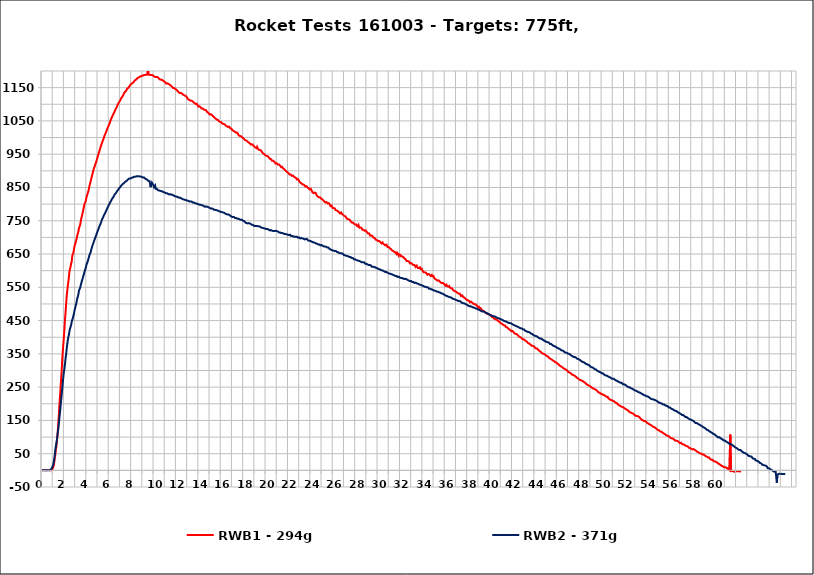
| Category | RWB1 - 294g | RWB2 - 371g |
|---|---|---|
| 0.0 | 0 | 1 |
| 0.05000000000000002 | 1 | 1 |
| 0.1 | 1 | 0 |
| 0.15 | 1 | 0 |
| 0.20000000000000004 | 1 | 0 |
| 0.25 | 1 | 1 |
| 0.30000000000000004 | 1 | 0 |
| 0.35 | 1 | 0 |
| 0.4 | 0 | 0 |
| 0.45000000000000007 | 1 | 0 |
| 0.5000000000000001 | 1 | 1 |
| 0.55 | 1 | 1 |
| 0.6000000000000001 | 1 | 0 |
| 0.65 | 0 | 1 |
| 0.7000000000000001 | 0 | 1 |
| 0.7500000000000001 | 1 | 1 |
| 0.8 | 0 | 3 |
| 0.8500000000000001 | 2 | 6 |
| 0.9 | 2 | 8 |
| 0.9500000000000001 | 5 | 12 |
| 1.0 | 9 | 17 |
| 1.05 | 15 | 25 |
| 1.1 | 26 | 36 |
| 1.15 | 38 | 49 |
| 1.2 | 51 | 65 |
| 1.25 | 65 | 75 |
| 1.3 | 77 | 85 |
| 1.35 | 95 | 96 |
| 1.4 | 114 | 111 |
| 1.45 | 138 | 123 |
| 1.5 | 165 | 139 |
| 1.55 | 193 | 157 |
| 1.6 | 219 | 172 |
| 1.65 | 244 | 190 |
| 1.7 | 271 | 208 |
| 1.75 | 295 | 225 |
| 1.8 | 329 | 243 |
| 1.85 | 355 | 260 |
| 1.9 | 377 | 280 |
| 1.9500000000000002 | 398 | 294 |
| 2.0 | 424 | 305 |
| 2.05 | 452 | 319 |
| 2.1 | 473 | 335 |
| 2.15 | 498 | 348 |
| 2.2 | 522 | 364 |
| 2.25 | 538 | 378 |
| 2.3000000000000003 | 553 | 390 |
| 2.35 | 566 | 400 |
| 2.4 | 580 | 408 |
| 2.45 | 598 | 418 |
| 2.5 | 599 | 426 |
| 2.5500000000000003 | 612 | 431 |
| 2.6 | 622 | 437 |
| 2.65 | 626 | 446 |
| 2.7 | 644 | 452 |
| 2.75 | 649 | 457 |
| 2.8000000000000003 | 654 | 464 |
| 2.85 | 663 | 470 |
| 2.9 | 673 | 480 |
| 2.95 | 679 | 486 |
| 3.0 | 684 | 494 |
| 3.0500000000000003 | 691 | 500 |
| 3.1 | 697 | 508 |
| 3.15 | 706 | 517 |
| 3.2 | 708 | 522 |
| 3.25 | 718 | 529 |
| 3.3000000000000003 | 728 | 540 |
| 3.35 | 732 | 543 |
| 3.4 | 737 | 548 |
| 3.45 | 746 | 555 |
| 3.5 | 756 | 561 |
| 3.5500000000000003 | 762 | 568 |
| 3.6 | 770 | 573 |
| 3.65 | 777 | 579 |
| 3.7 | 785 | 585 |
| 3.75 | 794 | 591 |
| 3.8000000000000003 | 801 | 597 |
| 3.85 | 803 | 603 |
| 3.9 | 808 | 607 |
| 3.9499999999999997 | 817 | 615 |
| 4.000000000000001 | 824 | 621 |
| 4.050000000000001 | 829 | 625 |
| 4.1000000000000005 | 835 | 630 |
| 4.15 | 840 | 636 |
| 4.2 | 848 | 642 |
| 4.250000000000001 | 857 | 648 |
| 4.300000000000001 | 862 | 652 |
| 4.3500000000000005 | 870 | 656 |
| 4.4 | 876 | 664 |
| 4.45 | 883 | 669 |
| 4.500000000000001 | 890 | 675 |
| 4.550000000000001 | 896 | 680 |
| 4.6000000000000005 | 903 | 684 |
| 4.65 | 909 | 689 |
| 4.700000000000001 | 913 | 694 |
| 4.750000000000001 | 919 | 697 |
| 4.800000000000001 | 923 | 703 |
| 4.8500000000000005 | 929 | 707 |
| 4.9 | 934 | 713 |
| 4.950000000000001 | 940 | 717 |
| 5.000000000000001 | 946 | 722 |
| 5.050000000000001 | 952 | 726 |
| 5.1000000000000005 | 956 | 731 |
| 5.15 | 963 | 734 |
| 5.200000000000001 | 968 | 739 |
| 5.250000000000001 | 974 | 742 |
| 5.300000000000001 | 979 | 748 |
| 5.3500000000000005 | 983 | 753 |
| 5.4 | 988 | 756 |
| 5.450000000000001 | 993 | 760 |
| 5.500000000000001 | 997 | 764 |
| 5.550000000000001 | 1003 | 768 |
| 5.6000000000000005 | 1007 | 771 |
| 5.65 | 1011 | 774 |
| 5.700000000000001 | 1015 | 778 |
| 5.750000000000001 | 1019 | 782 |
| 5.800000000000001 | 1024 | 785 |
| 5.8500000000000005 | 1028 | 789 |
| 5.9 | 1032 | 793 |
| 5.950000000000001 | 1036 | 796 |
| 6.000000000000001 | 1040 | 799 |
| 6.050000000000001 | 1044 | 802 |
| 6.1000000000000005 | 1050 | 806 |
| 6.15 | 1054 | 809 |
| 6.200000000000001 | 1057 | 812 |
| 6.250000000000001 | 1062 | 816 |
| 6.300000000000001 | 1064 | 819 |
| 6.3500000000000005 | 1069 | 820 |
| 6.4 | 1072 | 823 |
| 6.450000000000001 | 1076 | 826 |
| 6.500000000000001 | 1080 | 830 |
| 6.550000000000001 | 1084 | 831 |
| 6.6000000000000005 | 1087 | 833 |
| 6.65 | 1090 | 836 |
| 6.700000000000001 | 1094 | 839 |
| 6.750000000000001 | 1098 | 840 |
| 6.800000000000001 | 1102 | 843 |
| 6.8500000000000005 | 1105 | 846 |
| 6.9 | 1107 | 848 |
| 6.950000000000001 | 1110 | 850 |
| 7.000000000000001 | 1113 | 852 |
| 7.050000000000001 | 1117 | 855 |
| 7.1000000000000005 | 1119 | 857 |
| 7.15 | 1122 | 858 |
| 7.200000000000001 | 1125 | 860 |
| 7.250000000000001 | 1127 | 861 |
| 7.300000000000001 | 1132 | 863 |
| 7.3500000000000005 | 1134 | 864 |
| 7.4 | 1137 | 866 |
| 7.450000000000001 | 1139 | 868 |
| 7.500000000000001 | 1140 | 869 |
| 7.550000000000001 | 1143 | 871 |
| 7.6000000000000005 | 1147 | 871 |
| 7.65 | 1147 | 873 |
| 7.700000000000001 | 1149 | 875 |
| 7.750000000000001 | 1152 | 875 |
| 7.800000000000001 | 1154 | 877 |
| 7.8500000000000005 | 1157 | 877 |
| 7.9 | 1159 | 877 |
| 7.950000000000001 | 1160 | 880 |
| 8.0 | 1162 | 879 |
| 8.05 | 1163 | 880 |
| 8.100000000000001 | 1164 | 880 |
| 8.15 | 1166 | 881 |
| 8.200000000000001 | 1168 | 882 |
| 8.25 | 1170 | 882 |
| 8.3 | 1172 | 882 |
| 8.350000000000001 | 1173 | 882 |
| 8.4 | 1174 | 883 |
| 8.450000000000001 | 1175 | 883 |
| 8.5 | 1178 | 884 |
| 8.55 | 1178 | 884 |
| 8.600000000000001 | 1180 | 884 |
| 8.65 | 1181 | 884 |
| 8.700000000000001 | 1182 | 883 |
| 8.75 | 1182 | 883 |
| 8.8 | 1184 | 883 |
| 8.850000000000001 | 1184 | 882 |
| 8.9 | 1185 | 882 |
| 8.950000000000001 | 1187 | 882 |
| 9.0 | 1186 | 880 |
| 9.05 | 1186 | 879 |
| 9.100000000000001 | 1188 | 880 |
| 9.15 | 1188 | 878 |
| 9.200000000000001 | 1188 | 877 |
| 9.25 | 1189 | 877 |
| 9.3 | 1189 | 875 |
| 9.350000000000001 | 1189 | 874 |
| 9.4 | 1190 | 873 |
| 9.450000000000001 | 1215 | 872 |
| 9.500000000000002 | 1189 | 870 |
| 9.55 | 1190 | 869 |
| 9.600000000000001 | 1189 | 869 |
| 9.65 | 1187 | 867 |
| 9.700000000000001 | 1188 | 851 |
| 9.750000000000002 | 1188 | 861 |
| 9.8 | 1188 | 865 |
| 9.850000000000001 | 1188 | 863 |
| 9.9 | 1187 | 860 |
| 9.950000000000001 | 1187 | 857 |
| 10.000000000000002 | 1184 | 851 |
| 10.05 | 1184 | 853 |
| 10.100000000000001 | 1182 | 856 |
| 10.15 | 1182 | 846 |
| 10.200000000000001 | 1182 | 847 |
| 10.250000000000002 | 1182 | 846 |
| 10.3 | 1182 | 845 |
| 10.350000000000001 | 1181 | 842 |
| 10.4 | 1179 | 841 |
| 10.450000000000001 | 1177 | 841 |
| 10.500000000000002 | 1175 | 840 |
| 10.55 | 1175 | 840 |
| 10.600000000000001 | 1174 | 839 |
| 10.65 | 1174 | 839 |
| 10.700000000000001 | 1174 | 840 |
| 10.750000000000002 | 1173 | 838 |
| 10.8 | 1171 | 837 |
| 10.850000000000001 | 1170 | 836 |
| 10.9 | 1169 | 837 |
| 10.950000000000001 | 1168 | 835 |
| 11.000000000000002 | 1166 | 836 |
| 11.05 | 1164 | 833 |
| 11.100000000000001 | 1162 | 833 |
| 11.15 | 1161 | 833 |
| 11.200000000000001 | 1163 | 833 |
| 11.250000000000002 | 1162 | 831 |
| 11.3 | 1161 | 830 |
| 11.350000000000001 | 1160 | 829 |
| 11.4 | 1159 | 830 |
| 11.450000000000001 | 1156 | 830 |
| 11.500000000000002 | 1156 | 828 |
| 11.55 | 1155 | 828 |
| 11.600000000000001 | 1153 | 826 |
| 11.65 | 1150 | 828 |
| 11.700000000000001 | 1149 | 827 |
| 11.750000000000002 | 1148 | 826 |
| 11.8 | 1149 | 824 |
| 11.850000000000001 | 1147 | 824 |
| 11.9 | 1146 | 825 |
| 11.950000000000001 | 1144 | 823 |
| 12.000000000000002 | 1144 | 821 |
| 12.05 | 1142 | 822 |
| 12.100000000000001 | 1140 | 821 |
| 12.15 | 1138 | 821 |
| 12.200000000000001 | 1136 | 820 |
| 12.250000000000002 | 1136 | 819 |
| 12.3 | 1134 | 819 |
| 12.350000000000001 | 1134 | 819 |
| 12.4 | 1134 | 818 |
| 12.450000000000001 | 1132 | 817 |
| 12.500000000000002 | 1132 | 816 |
| 12.55 | 1129 | 815 |
| 12.600000000000001 | 1129 | 814 |
| 12.65 | 1128 | 814 |
| 12.700000000000001 | 1127 | 815 |
| 12.750000000000002 | 1125 | 813 |
| 12.8 | 1125 | 813 |
| 12.850000000000001 | 1126 | 812 |
| 12.9 | 1123 | 811 |
| 12.950000000000001 | 1120 | 811 |
| 13.000000000000002 | 1117 | 811 |
| 13.05 | 1116 | 810 |
| 13.100000000000001 | 1114 | 810 |
| 13.15 | 1113 | 808 |
| 13.200000000000001 | 1112 | 807 |
| 13.250000000000002 | 1111 | 808 |
| 13.3 | 1111 | 807 |
| 13.350000000000001 | 1111 | 808 |
| 13.4 | 1110 | 806 |
| 13.450000000000001 | 1108 | 805 |
| 13.500000000000002 | 1107 | 804 |
| 13.55 | 1106 | 805 |
| 13.600000000000001 | 1104 | 804 |
| 13.65 | 1102 | 803 |
| 13.700000000000001 | 1101 | 802 |
| 13.750000000000002 | 1102 | 802 |
| 13.8 | 1102 | 801 |
| 13.850000000000001 | 1099 | 801 |
| 13.9 | 1097 | 801 |
| 13.950000000000001 | 1093 | 800 |
| 14.000000000000002 | 1094 | 798 |
| 14.05 | 1094 | 798 |
| 14.100000000000001 | 1094 | 797 |
| 14.15 | 1091 | 798 |
| 14.200000000000001 | 1089 | 797 |
| 14.250000000000002 | 1087 | 797 |
| 14.3 | 1088 | 797 |
| 14.350000000000001 | 1087 | 796 |
| 14.4 | 1087 | 794 |
| 14.450000000000001 | 1084 | 794 |
| 14.500000000000002 | 1082 | 794 |
| 14.55 | 1083 | 792 |
| 14.600000000000001 | 1085 | 792 |
| 14.65 | 1082 | 793 |
| 14.700000000000001 | 1078 | 793 |
| 14.750000000000002 | 1076 | 792 |
| 14.8 | 1076 | 790 |
| 14.850000000000001 | 1075 | 791 |
| 14.9 | 1072 | 790 |
| 14.950000000000001 | 1071 | 789 |
| 15.000000000000002 | 1069 | 789 |
| 15.05 | 1071 | 787 |
| 15.100000000000001 | 1070 | 787 |
| 15.15 | 1068 | 787 |
| 15.200000000000001 | 1067 | 785 |
| 15.250000000000002 | 1064 | 786 |
| 15.3 | 1063 | 785 |
| 15.350000000000001 | 1061 | 783 |
| 15.4 | 1060 | 783 |
| 15.450000000000001 | 1058 | 783 |
| 15.500000000000002 | 1057 | 783 |
| 15.55 | 1055 | 782 |
| 15.600000000000001 | 1054 | 782 |
| 15.65 | 1053 | 781 |
| 15.700000000000001 | 1053 | 780 |
| 15.750000000000002 | 1052 | 780 |
| 15.8 | 1049 | 779 |
| 15.850000000000001 | 1047 | 778 |
| 15.9 | 1047 | 777 |
| 15.950000000000001 | 1047 | 777 |
| 16.0 | 1046 | 776 |
| 16.05 | 1044 | 776 |
| 16.099999999999998 | 1042 | 776 |
| 16.15 | 1042 | 775 |
| 16.2 | 1041 | 775 |
| 16.25 | 1042 | 774 |
| 16.3 | 1040 | 774 |
| 16.349999999999998 | 1037 | 772 |
| 16.4 | 1036 | 771 |
| 16.45 | 1035 | 770 |
| 16.5 | 1034 | 770 |
| 16.55 | 1032 | 769 |
| 16.599999999999998 | 1032 | 767 |
| 16.65 | 1034 | 769 |
| 16.7 | 1033 | 767 |
| 16.75 | 1030 | 767 |
| 16.8 | 1028 | 765 |
| 16.849999999999998 | 1028 | 764 |
| 16.9 | 1027 | 764 |
| 16.95 | 1025 | 762 |
| 17.0 | 1022 | 762 |
| 17.05 | 1021 | 761 |
| 17.099999999999998 | 1020 | 761 |
| 17.15 | 1019 | 761 |
| 17.2 | 1018 | 760 |
| 17.25 | 1016 | 758 |
| 17.3 | 1015 | 759 |
| 17.349999999999998 | 1014 | 758 |
| 17.4 | 1015 | 757 |
| 17.45 | 1015 | 756 |
| 17.5 | 1011 | 756 |
| 17.55 | 1007 | 756 |
| 17.599999999999998 | 1005 | 754 |
| 17.65 | 1005 | 754 |
| 17.7 | 1005 | 753 |
| 17.75 | 1004 | 753 |
| 17.8 | 1003 | 752 |
| 17.849999999999998 | 1001 | 753 |
| 17.9 | 1001 | 752 |
| 17.95 | 999 | 750 |
| 18.0 | 996 | 749 |
| 18.05 | 995 | 749 |
| 18.099999999999998 | 994 | 748 |
| 18.15 | 992 | 745 |
| 18.2 | 991 | 745 |
| 18.25 | 991 | 743 |
| 18.3 | 990 | 742 |
| 18.349999999999998 | 988 | 742 |
| 18.4 | 986 | 742 |
| 18.45 | 985 | 743 |
| 18.5 | 985 | 743 |
| 18.55 | 983 | 742 |
| 18.599999999999998 | 983 | 741 |
| 18.65 | 979 | 740 |
| 18.7 | 978 | 739 |
| 18.75 | 980 | 738 |
| 18.8 | 980 | 739 |
| 18.849999999999998 | 977 | 737 |
| 18.9 | 974 | 736 |
| 18.95 | 973 | 734 |
| 19.0 | 974 | 734 |
| 19.05 | 970 | 734 |
| 19.1 | 968 | 735 |
| 19.15 | 968 | 734 |
| 19.2 | 972 | 734 |
| 19.25 | 968 | 734 |
| 19.3 | 966 | 733 |
| 19.35 | 963 | 733 |
| 19.4 | 963 | 734 |
| 19.45 | 963 | 733 |
| 19.5 | 962 | 731 |
| 19.55 | 961 | 730 |
| 19.6 | 959 | 730 |
| 19.65 | 956 | 729 |
| 19.7 | 954 | 728 |
| 19.75 | 952 | 728 |
| 19.8 | 951 | 728 |
| 19.85 | 950 | 727 |
| 19.9 | 948 | 726 |
| 19.95 | 946 | 726 |
| 20.0 | 946 | 725 |
| 20.05 | 945 | 725 |
| 20.1 | 945 | 725 |
| 20.15 | 944 | 725 |
| 20.2 | 941 | 725 |
| 20.25 | 940 | 723 |
| 20.3 | 938 | 722 |
| 20.35 | 936 | 721 |
| 20.4 | 935 | 721 |
| 20.45 | 935 | 722 |
| 20.5 | 932 | 721 |
| 20.55 | 930 | 720 |
| 20.6 | 931 | 720 |
| 20.65 | 930 | 719 |
| 20.7 | 929 | 719 |
| 20.75 | 927 | 719 |
| 20.8 | 925 | 718 |
| 20.85 | 922 | 720 |
| 20.9 | 924 | 719 |
| 20.95 | 923 | 719 |
| 21.0 | 922 | 718 |
| 21.05 | 919 | 718 |
| 21.1 | 916 | 716 |
| 21.15 | 919 | 715 |
| 21.2 | 920 | 715 |
| 21.25 | 916 | 715 |
| 21.3 | 913 | 714 |
| 21.35 | 911 | 713 |
| 21.4 | 913 | 713 |
| 21.45 | 912 | 713 |
| 21.5 | 908 | 713 |
| 21.55 | 905 | 712 |
| 21.6 | 906 | 712 |
| 21.65 | 904 | 710 |
| 21.7 | 902 | 710 |
| 21.75 | 902 | 710 |
| 21.8 | 899 | 709 |
| 21.85 | 896 | 709 |
| 21.9 | 896 | 710 |
| 21.95 | 895 | 708 |
| 22.0 | 893 | 707 |
| 22.05 | 891 | 707 |
| 22.1 | 889 | 707 |
| 22.15 | 891 | 708 |
| 22.2 | 889 | 705 |
| 22.25 | 887 | 704 |
| 22.3 | 885 | 705 |
| 22.35 | 884 | 704 |
| 22.4 | 886 | 704 |
| 22.45 | 886 | 703 |
| 22.5 | 882 | 704 |
| 22.55 | 879 | 702 |
| 22.6 | 880 | 703 |
| 22.65 | 882 | 702 |
| 22.7 | 878 | 702 |
| 22.75 | 874 | 702 |
| 22.8 | 873 | 700 |
| 22.85 | 875 | 699 |
| 22.9 | 873 | 700 |
| 22.95 | 870 | 700 |
| 23.0 | 866 | 699 |
| 23.05 | 865 | 697 |
| 23.1 | 864 | 698 |
| 23.15 | 863 | 698 |
| 23.2 | 861 | 697 |
| 23.25 | 859 | 697 |
| 23.3 | 859 | 697 |
| 23.35 | 860 | 696 |
| 23.4 | 858 | 695 |
| 23.45 | 855 | 694 |
| 23.5 | 853 | 694 |
| 23.55 | 853 | 695 |
| 23.6 | 854 | 694 |
| 23.65 | 852 | 695 |
| 23.7 | 850 | 693 |
| 23.75 | 850 | 691 |
| 23.8 | 848 | 690 |
| 23.85 | 847 | 690 |
| 23.9 | 844 | 689 |
| 23.95 | 842 | 689 |
| 24.0 | 846 | 688 |
| 24.05 | 844 | 688 |
| 24.1 | 839 | 688 |
| 24.15 | 835 | 686 |
| 24.2 | 834 | 685 |
| 24.25 | 833 | 685 |
| 24.3 | 834 | 684 |
| 24.35 | 835 | 684 |
| 24.4 | 837 | 683 |
| 24.45 | 833 | 682 |
| 24.5 | 828 | 682 |
| 24.55 | 826 | 681 |
| 24.6 | 823 | 680 |
| 24.65 | 823 | 679 |
| 24.7 | 821 | 679 |
| 24.75 | 822 | 679 |
| 24.8 | 821 | 677 |
| 24.85 | 818 | 676 |
| 24.9 | 817 | 676 |
| 24.95 | 816 | 677 |
| 25.0 | 815 | 675 |
| 25.05 | 813 | 675 |
| 25.1 | 812 | 674 |
| 25.15 | 810 | 673 |
| 25.2 | 808 | 672 |
| 25.25 | 806 | 673 |
| 25.3 | 805 | 673 |
| 25.35 | 805 | 672 |
| 25.4 | 806 | 672 |
| 25.45 | 804 | 670 |
| 25.5 | 802 | 670 |
| 25.55 | 800 | 670 |
| 25.6 | 803 | 668 |
| 25.65 | 802 | 666 |
| 25.7 | 798 | 666 |
| 25.75 | 794 | 664 |
| 25.8 | 795 | 663 |
| 25.85 | 796 | 662 |
| 25.9 | 792 | 663 |
| 25.95 | 788 | 661 |
| 26.0 | 787 | 661 |
| 26.05 | 788 | 660 |
| 26.1 | 789 | 659 |
| 26.15 | 787 | 659 |
| 26.2 | 782 | 659 |
| 26.25 | 780 | 659 |
| 26.3 | 781 | 657 |
| 26.35 | 779 | 656 |
| 26.4 | 779 | 656 |
| 26.45 | 777 | 655 |
| 26.5 | 776 | 654 |
| 26.55 | 774 | 653 |
| 26.6 | 772 | 653 |
| 26.65 | 774 | 652 |
| 26.7 | 775 | 653 |
| 26.75 | 772 | 652 |
| 26.8 | 770 | 652 |
| 26.85 | 769 | 651 |
| 26.9 | 767 | 649 |
| 26.95 | 765 | 647 |
| 27.0 | 764 | 647 |
| 27.05 | 766 | 646 |
| 27.1 | 763 | 645 |
| 27.15 | 760 | 645 |
| 27.2 | 757 | 644 |
| 27.25 | 758 | 644 |
| 27.3 | 755 | 643 |
| 27.35 | 755 | 643 |
| 27.4 | 754 | 642 |
| 27.45 | 756 | 641 |
| 27.5 | 752 | 642 |
| 27.55 | 748 | 641 |
| 27.6 | 746 | 639 |
| 27.65 | 745 | 638 |
| 27.7 | 745 | 638 |
| 27.75 | 745 | 638 |
| 27.8 | 743 | 636 |
| 27.85 | 741 | 634 |
| 27.9 | 739 | 634 |
| 27.95 | 739 | 634 |
| 28.0 | 740 | 633 |
| 28.05 | 739 | 632 |
| 28.1 | 735 | 632 |
| 28.15 | 733 | 631 |
| 28.2 | 733 | 630 |
| 28.25 | 737 | 630 |
| 28.3 | 733 | 629 |
| 28.35 | 729 | 629 |
| 28.4 | 727 | 628 |
| 28.45 | 730 | 627 |
| 28.5 | 729 | 626 |
| 28.55 | 727 | 625 |
| 28.6 | 723 | 626 |
| 28.65 | 725 | 625 |
| 28.7 | 723 | 624 |
| 28.75 | 722 | 625 |
| 28.8 | 720 | 623 |
| 28.85 | 721 | 621 |
| 28.9 | 721 | 621 |
| 28.95 | 720 | 621 |
| 29.0 | 716 | 620 |
| 29.05 | 713 | 619 |
| 29.1 | 712 | 618 |
| 29.15 | 712 | 617 |
| 29.2 | 712 | 617 |
| 29.25 | 709 | 617 |
| 29.3 | 705 | 617 |
| 29.35 | 705 | 616 |
| 29.4 | 706 | 614 |
| 29.45 | 706 | 612 |
| 29.5 | 704 | 612 |
| 29.55 | 701 | 612 |
| 29.6 | 699 | 611 |
| 29.65 | 698 | 611 |
| 29.7 | 698 | 610 |
| 29.75 | 695 | 610 |
| 29.8 | 693 | 609 |
| 29.85 | 693 | 608 |
| 29.9 | 692 | 607 |
| 29.95 | 689 | 607 |
| 30.0 | 689 | 606 |
| 30.05 | 691 | 605 |
| 30.1 | 689 | 604 |
| 30.15 | 688 | 604 |
| 30.2 | 686 | 603 |
| 30.25 | 683 | 602 |
| 30.3 | 682 | 602 |
| 30.35 | 684 | 601 |
| 30.4 | 685 | 600 |
| 30.45 | 681 | 600 |
| 30.5 | 679 | 599 |
| 30.55 | 679 | 598 |
| 30.6 | 677 | 598 |
| 30.65 | 676 | 596 |
| 30.7 | 676 | 597 |
| 30.75 | 678 | 596 |
| 30.8 | 675 | 595 |
| 30.85 | 671 | 594 |
| 30.9 | 670 | 592 |
| 30.95 | 671 | 592 |
| 31.0 | 669 | 593 |
| 31.05 | 667 | 591 |
| 31.1 | 665 | 590 |
| 31.15 | 665 | 590 |
| 31.2 | 665 | 589 |
| 31.25 | 661 | 589 |
| 31.3 | 659 | 588 |
| 31.35 | 659 | 587 |
| 31.4 | 658 | 587 |
| 31.45 | 657 | 586 |
| 31.5 | 657 | 585 |
| 31.55 | 654 | 584 |
| 31.6 | 652 | 584 |
| 31.65 | 650 | 584 |
| 31.7 | 654 | 582 |
| 31.75 | 652 | 581 |
| 31.8 | 649 | 581 |
| 31.85 | 645 | 582 |
| 31.9 | 649 | 582 |
| 31.950000000000003 | 649 | 579 |
| 32.0 | 647 | 578 |
| 32.05 | 643 | 578 |
| 32.1 | 642 | 578 |
| 32.15 | 643 | 578 |
| 32.2 | 643 | 578 |
| 32.25 | 641 | 576 |
| 32.3 | 638 | 576 |
| 32.35 | 637 | 575 |
| 32.4 | 639 | 575 |
| 32.45 | 635 | 576 |
| 32.5 | 632 | 574 |
| 32.55 | 629 | 574 |
| 32.6 | 629 | 571 |
| 32.65 | 629 | 572 |
| 32.7 | 628 | 570 |
| 32.75 | 628 | 570 |
| 32.8 | 626 | 569 |
| 32.85 | 622 | 569 |
| 32.9 | 623 | 568 |
| 32.95 | 623 | 569 |
| 33.0 | 622 | 568 |
| 33.05 | 620 | 566 |
| 33.1 | 617 | 567 |
| 33.15 | 617 | 566 |
| 33.2 | 617 | 566 |
| 33.25 | 617 | 563 |
| 33.3 | 614 | 563 |
| 33.35 | 611 | 564 |
| 33.4 | 614 | 563 |
| 33.45 | 615 | 562 |
| 33.5 | 612 | 561 |
| 33.55 | 608 | 561 |
| 33.6 | 607 | 560 |
| 33.65 | 608 | 559 |
| 33.7 | 611 | 558 |
| 33.75 | 610 | 558 |
| 33.8 | 605 | 557 |
| 33.85 | 605 | 557 |
| 33.9 | 606 | 556 |
| 33.95 | 603 | 555 |
| 34.0 | 598 | 553 |
| 34.05 | 596 | 554 |
| 34.1 | 595 | 553 |
| 34.15 | 597 | 552 |
| 34.2 | 595 | 552 |
| 34.25 | 594 | 551 |
| 34.3 | 593 | 551 |
| 34.35 | 591 | 550 |
| 34.4 | 588 | 549 |
| 34.45 | 588 | 550 |
| 34.5 | 590 | 548 |
| 34.55 | 590 | 546 |
| 34.6 | 588 | 547 |
| 34.65 | 585 | 546 |
| 34.7 | 584 | 544 |
| 34.75 | 587 | 544 |
| 34.8 | 587 | 543 |
| 34.85 | 583 | 543 |
| 34.9 | 581 | 542 |
| 34.95 | 584 | 541 |
| 35.0 | 579 | 540 |
| 35.05 | 577 | 540 |
| 35.1 | 575 | 539 |
| 35.15 | 575 | 539 |
| 35.2 | 573 | 538 |
| 35.25 | 572 | 537 |
| 35.3 | 570 | 537 |
| 35.35 | 571 | 537 |
| 35.4 | 571 | 536 |
| 35.45 | 571 | 535 |
| 35.5 | 568 | 534 |
| 35.55 | 565 | 534 |
| 35.6 | 564 | 533 |
| 35.65 | 564 | 532 |
| 35.7 | 563 | 531 |
| 35.75 | 562 | 531 |
| 35.8 | 563 | 528 |
| 35.85 | 562 | 529 |
| 35.9 | 560 | 528 |
| 35.95 | 557 | 527 |
| 36.0 | 555 | 527 |
| 36.05 | 558 | 525 |
| 36.1 | 558 | 525 |
| 36.15 | 554 | 524 |
| 36.2 | 551 | 524 |
| 36.25 | 552 | 522 |
| 36.3 | 554 | 521 |
| 36.35 | 554 | 521 |
| 36.4 | 550 | 520 |
| 36.45 | 547 | 520 |
| 36.5 | 547 | 520 |
| 36.55 | 546 | 519 |
| 36.6 | 547 | 516 |
| 36.65 | 545 | 516 |
| 36.7 | 542 | 516 |
| 36.75 | 539 | 515 |
| 36.8 | 539 | 515 |
| 36.85 | 538 | 514 |
| 36.9 | 538 | 514 |
| 36.95 | 536 | 512 |
| 37.0 | 536 | 512 |
| 37.05 | 534 | 511 |
| 37.1 | 533 | 510 |
| 37.15 | 532 | 509 |
| 37.2 | 531 | 509 |
| 37.25 | 531 | 509 |
| 37.3 | 531 | 508 |
| 37.35 | 528 | 508 |
| 37.4 | 524 | 505 |
| 37.45 | 523 | 504 |
| 37.5 | 526 | 505 |
| 37.55 | 523 | 503 |
| 37.6 | 521 | 502 |
| 37.65 | 520 | 502 |
| 37.7 | 519 | 500 |
| 37.75 | 517 | 501 |
| 37.8 | 516 | 500 |
| 37.85 | 515 | 499 |
| 37.9 | 513 | 499 |
| 37.95 | 512 | 497 |
| 38.0 | 511 | 496 |
| 38.05 | 511 | 495 |
| 38.1 | 510 | 494 |
| 38.15 | 509 | 493 |
| 38.2 | 505 | 493 |
| 38.25 | 504 | 493 |
| 38.300000000000004 | 507 | 492 |
| 38.35 | 506 | 492 |
| 38.4 | 504 | 491 |
| 38.45 | 502 | 490 |
| 38.5 | 501 | 489 |
| 38.550000000000004 | 500 | 489 |
| 38.6 | 499 | 487 |
| 38.65 | 497 | 488 |
| 38.7 | 499 | 487 |
| 38.75 | 499 | 486 |
| 38.800000000000004 | 496 | 485 |
| 38.85 | 493 | 485 |
| 38.9 | 491 | 484 |
| 38.95 | 492 | 483 |
| 39.0 | 492 | 483 |
| 39.050000000000004 | 488 | 482 |
| 39.1 | 488 | 483 |
| 39.15 | 488 | 480 |
| 39.2 | 488 | 479 |
| 39.25 | 482 | 478 |
| 39.300000000000004 | 481 | 478 |
| 39.35 | 480 | 477 |
| 39.4 | 480 | 477 |
| 39.45 | 478 | 477 |
| 39.5 | 476 | 475 |
| 39.550000000000004 | 475 | 475 |
| 39.6 | 474 | 474 |
| 39.65 | 473 | 473 |
| 39.7 | 473 | 473 |
| 39.75 | 470 | 472 |
| 39.800000000000004 | 469 | 471 |
| 39.85 | 469 | 470 |
| 39.9 | 469 | 469 |
| 39.95 | 468 | 468 |
| 40.0 | 467 | 468 |
| 40.050000000000004 | 467 | 466 |
| 40.1 | 465 | 466 |
| 40.15 | 461 | 465 |
| 40.2 | 462 | 465 |
| 40.25 | 460 | 463 |
| 40.300000000000004 | 457 | 463 |
| 40.35 | 456 | 463 |
| 40.4 | 455 | 461 |
| 40.45 | 455 | 462 |
| 40.5 | 454 | 461 |
| 40.550000000000004 | 453 | 460 |
| 40.6 | 454 | 459 |
| 40.65 | 451 | 458 |
| 40.7 | 448 | 458 |
| 40.75 | 448 | 457 |
| 40.800000000000004 | 447 | 457 |
| 40.85 | 446 | 456 |
| 40.9 | 444 | 455 |
| 40.95 | 442 | 454 |
| 41.0 | 441 | 453 |
| 41.050000000000004 | 441 | 453 |
| 41.1 | 439 | 453 |
| 41.15 | 438 | 451 |
| 41.2 | 437 | 450 |
| 41.25 | 436 | 449 |
| 41.300000000000004 | 436 | 449 |
| 41.35 | 435 | 448 |
| 41.4 | 431 | 446 |
| 41.45 | 431 | 447 |
| 41.5 | 430 | 447 |
| 41.550000000000004 | 428 | 445 |
| 41.6 | 427 | 443 |
| 41.65 | 425 | 443 |
| 41.7 | 424 | 444 |
| 41.75 | 423 | 443 |
| 41.800000000000004 | 422 | 442 |
| 41.85 | 420 | 442 |
| 41.9 | 418 | 440 |
| 41.95 | 417 | 440 |
| 42.0 | 419 | 439 |
| 42.050000000000004 | 418 | 438 |
| 42.1 | 415 | 436 |
| 42.15 | 413 | 436 |
| 42.2 | 411 | 436 |
| 42.25 | 410 | 435 |
| 42.300000000000004 | 410 | 433 |
| 42.35 | 410 | 433 |
| 42.4 | 409 | 433 |
| 42.45 | 408 | 432 |
| 42.5 | 405 | 431 |
| 42.550000000000004 | 403 | 430 |
| 42.6 | 402 | 428 |
| 42.65 | 401 | 428 |
| 42.7 | 400 | 428 |
| 42.75 | 400 | 427 |
| 42.800000000000004 | 398 | 427 |
| 42.85 | 397 | 426 |
| 42.9 | 394 | 424 |
| 42.95 | 395 | 423 |
| 43.0 | 394 | 422 |
| 43.050000000000004 | 391 | 423 |
| 43.1 | 391 | 421 |
| 43.15 | 390 | 419 |
| 43.2 | 389 | 419 |
| 43.25 | 387 | 418 |
| 43.300000000000004 | 386 | 417 |
| 43.35 | 387 | 416 |
| 43.4 | 382 | 416 |
| 43.45 | 382 | 416 |
| 43.5 | 381 | 415 |
| 43.550000000000004 | 380 | 414 |
| 43.6 | 378 | 413 |
| 43.65 | 377 | 411 |
| 43.7 | 375 | 411 |
| 43.75 | 375 | 410 |
| 43.800000000000004 | 374 | 408 |
| 43.85 | 374 | 407 |
| 43.9 | 373 | 408 |
| 43.95 | 371 | 405 |
| 44.0 | 369 | 405 |
| 44.050000000000004 | 368 | 404 |
| 44.1 | 366 | 403 |
| 44.15 | 366 | 403 |
| 44.2 | 366 | 402 |
| 44.25 | 363 | 401 |
| 44.300000000000004 | 362 | 400 |
| 44.35 | 361 | 398 |
| 44.4 | 359 | 398 |
| 44.45 | 357 | 396 |
| 44.5 | 357 | 396 |
| 44.550000000000004 | 355 | 396 |
| 44.6 | 353 | 395 |
| 44.65 | 352 | 394 |
| 44.7 | 351 | 392 |
| 44.75 | 350 | 391 |
| 44.800000000000004 | 350 | 390 |
| 44.85 | 349 | 390 |
| 44.9 | 348 | 389 |
| 44.95 | 347 | 387 |
| 45.0 | 345 | 387 |
| 45.050000000000004 | 344 | 386 |
| 45.1 | 343 | 386 |
| 45.15 | 342 | 385 |
| 45.2 | 341 | 385 |
| 45.25 | 340 | 384 |
| 45.300000000000004 | 337 | 382 |
| 45.35 | 336 | 380 |
| 45.4 | 335 | 380 |
| 45.45 | 334 | 380 |
| 45.5 | 333 | 378 |
| 45.550000000000004 | 330 | 377 |
| 45.6 | 330 | 376 |
| 45.65 | 328 | 374 |
| 45.7 | 329 | 374 |
| 45.75 | 326 | 373 |
| 45.800000000000004 | 325 | 374 |
| 45.85 | 325 | 372 |
| 45.9 | 324 | 371 |
| 45.95 | 321 | 369 |
| 46.0 | 321 | 368 |
| 46.050000000000004 | 320 | 367 |
| 46.1 | 319 | 365 |
| 46.15 | 316 | 366 |
| 46.2 | 315 | 365 |
| 46.25 | 315 | 364 |
| 46.300000000000004 | 313 | 362 |
| 46.35 | 311 | 361 |
| 46.4 | 311 | 361 |
| 46.45 | 309 | 360 |
| 46.5 | 308 | 359 |
| 46.550000000000004 | 307 | 359 |
| 46.6 | 306 | 358 |
| 46.65 | 306 | 355 |
| 46.7 | 304 | 355 |
| 46.75 | 303 | 354 |
| 46.800000000000004 | 302 | 355 |
| 46.85 | 301 | 353 |
| 46.9 | 299 | 351 |
| 46.95 | 297 | 351 |
| 47.0 | 295 | 350 |
| 47.050000000000004 | 294 | 350 |
| 47.1 | 294 | 348 |
| 47.15 | 292 | 348 |
| 47.2 | 292 | 346 |
| 47.25 | 290 | 345 |
| 47.300000000000004 | 288 | 344 |
| 47.35 | 288 | 343 |
| 47.4 | 287 | 342 |
| 47.45 | 288 | 341 |
| 47.5 | 285 | 341 |
| 47.550000000000004 | 285 | 341 |
| 47.6 | 283 | 339 |
| 47.65 | 282 | 339 |
| 47.7 | 280 | 338 |
| 47.75 | 278 | 336 |
| 47.800000000000004 | 277 | 335 |
| 47.85 | 277 | 335 |
| 47.9 | 275 | 334 |
| 47.95 | 274 | 333 |
| 48.0 | 272 | 332 |
| 48.050000000000004 | 271 | 331 |
| 48.1 | 271 | 329 |
| 48.15 | 270 | 328 |
| 48.2 | 269 | 327 |
| 48.25 | 268 | 326 |
| 48.300000000000004 | 268 | 327 |
| 48.35 | 266 | 325 |
| 48.4 | 265 | 324 |
| 48.45 | 265 | 323 |
| 48.5 | 263 | 322 |
| 48.550000000000004 | 261 | 320 |
| 48.6 | 259 | 321 |
| 48.65 | 259 | 319 |
| 48.7 | 257 | 318 |
| 48.75 | 256 | 317 |
| 48.800000000000004 | 255 | 316 |
| 48.85 | 255 | 316 |
| 48.9 | 254 | 315 |
| 48.95 | 253 | 312 |
| 49.0 | 251 | 312 |
| 49.050000000000004 | 249 | 310 |
| 49.1 | 248 | 309 |
| 49.15 | 247 | 309 |
| 49.2 | 246 | 308 |
| 49.25 | 244 | 307 |
| 49.300000000000004 | 245 | 306 |
| 49.35 | 244 | 304 |
| 49.4 | 243 | 304 |
| 49.45 | 242 | 303 |
| 49.5 | 241 | 301 |
| 49.550000000000004 | 239 | 300 |
| 49.6 | 237 | 300 |
| 49.65 | 236 | 298 |
| 49.7 | 234 | 297 |
| 49.75 | 235 | 296 |
| 49.800000000000004 | 233 | 295 |
| 49.85 | 232 | 295 |
| 49.9 | 230 | 295 |
| 49.95 | 230 | 292 |
| 50.0 | 229 | 292 |
| 50.050000000000004 | 229 | 292 |
| 50.1 | 227 | 290 |
| 50.15 | 226 | 289 |
| 50.2 | 226 | 288 |
| 50.25 | 224 | 286 |
| 50.300000000000004 | 223 | 286 |
| 50.35 | 222 | 285 |
| 50.4 | 221 | 285 |
| 50.45 | 221 | 284 |
| 50.5 | 221 | 283 |
| 50.550000000000004 | 217 | 282 |
| 50.6 | 215 | 281 |
| 50.65 | 214 | 280 |
| 50.7 | 212 | 280 |
| 50.75 | 212 | 279 |
| 50.800000000000004 | 211 | 278 |
| 50.85 | 211 | 276 |
| 50.9 | 210 | 276 |
| 50.95 | 209 | 275 |
| 51.0 | 208 | 274 |
| 51.050000000000004 | 208 | 275 |
| 51.1 | 207 | 274 |
| 51.15 | 205 | 272 |
| 51.2 | 204 | 271 |
| 51.25 | 203 | 270 |
| 51.300000000000004 | 203 | 271 |
| 51.35 | 201 | 269 |
| 51.4 | 199 | 268 |
| 51.45 | 197 | 266 |
| 51.5 | 195 | 265 |
| 51.550000000000004 | 195 | 265 |
| 51.6 | 194 | 265 |
| 51.65 | 193 | 263 |
| 51.7 | 191 | 263 |
| 51.75 | 191 | 263 |
| 51.800000000000004 | 190 | 262 |
| 51.85 | 190 | 259 |
| 51.9 | 189 | 259 |
| 51.95 | 188 | 259 |
| 52.0 | 186 | 258 |
| 52.050000000000004 | 185 | 257 |
| 52.1 | 184 | 255 |
| 52.15 | 184 | 255 |
| 52.2 | 183 | 254 |
| 52.25 | 181 | 252 |
| 52.300000000000004 | 180 | 252 |
| 52.35 | 179 | 250 |
| 52.4 | 178 | 251 |
| 52.45 | 175 | 250 |
| 52.5 | 175 | 248 |
| 52.550000000000004 | 174 | 247 |
| 52.6 | 173 | 246 |
| 52.65 | 172 | 246 |
| 52.7 | 172 | 244 |
| 52.75 | 171 | 244 |
| 52.800000000000004 | 170 | 243 |
| 52.85 | 168 | 242 |
| 52.9 | 166 | 241 |
| 52.95 | 165 | 240 |
| 53.0 | 164 | 240 |
| 53.050000000000004 | 163 | 239 |
| 53.1 | 163 | 238 |
| 53.15 | 163 | 237 |
| 53.2 | 163 | 235 |
| 53.25 | 162 | 235 |
| 53.300000000000004 | 160 | 234 |
| 53.35 | 159 | 234 |
| 53.4 | 156 | 233 |
| 53.45 | 155 | 232 |
| 53.5 | 153 | 231 |
| 53.550000000000004 | 152 | 230 |
| 53.6 | 151 | 229 |
| 53.65 | 150 | 228 |
| 53.7 | 149 | 227 |
| 53.75 | 148 | 226 |
| 53.800000000000004 | 148 | 226 |
| 53.85 | 148 | 225 |
| 53.9 | 147 | 224 |
| 53.95 | 145 | 223 |
| 54.0 | 145 | 222 |
| 54.050000000000004 | 142 | 222 |
| 54.1 | 141 | 221 |
| 54.15 | 140 | 221 |
| 54.2 | 140 | 219 |
| 54.25 | 138 | 218 |
| 54.300000000000004 | 137 | 216 |
| 54.35 | 136 | 215 |
| 54.4 | 135 | 216 |
| 54.45 | 134 | 214 |
| 54.5 | 131 | 213 |
| 54.550000000000004 | 131 | 214 |
| 54.6 | 131 | 213 |
| 54.65 | 130 | 212 |
| 54.7 | 128 | 211 |
| 54.75 | 128 | 211 |
| 54.800000000000004 | 126 | 210 |
| 54.85 | 125 | 209 |
| 54.9 | 123 | 208 |
| 54.95 | 122 | 207 |
| 55.0 | 123 | 207 |
| 55.050000000000004 | 121 | 204 |
| 55.1 | 118 | 204 |
| 55.15 | 118 | 203 |
| 55.2 | 116 | 202 |
| 55.25 | 116 | 202 |
| 55.300000000000004 | 115 | 202 |
| 55.35 | 115 | 200 |
| 55.4 | 113 | 199 |
| 55.45 | 112 | 198 |
| 55.5 | 110 | 197 |
| 55.550000000000004 | 110 | 198 |
| 55.6 | 108 | 195 |
| 55.65 | 108 | 195 |
| 55.7 | 107 | 195 |
| 55.75 | 105 | 194 |
| 55.800000000000004 | 104 | 193 |
| 55.85 | 104 | 193 |
| 55.9 | 103 | 192 |
| 55.95 | 103 | 189 |
| 56.0 | 100 | 189 |
| 56.05 | 99 | 189 |
| 56.1 | 98 | 188 |
| 56.15 | 97 | 186 |
| 56.2 | 95 | 185 |
| 56.25 | 96 | 184 |
| 56.3 | 94 | 183 |
| 56.35 | 95 | 183 |
| 56.4 | 93 | 182 |
| 56.45 | 92 | 180 |
| 56.5 | 91 | 181 |
| 56.55 | 89 | 179 |
| 56.6 | 91 | 178 |
| 56.65 | 89 | 178 |
| 56.7 | 89 | 176 |
| 56.75 | 88 | 175 |
| 56.8 | 88 | 174 |
| 56.85 | 85 | 173 |
| 56.9 | 83 | 172 |
| 56.95 | 82 | 171 |
| 57.0 | 82 | 170 |
| 57.05 | 83 | 169 |
| 57.1 | 81 | 167 |
| 57.15 | 79 | 166 |
| 57.2 | 78 | 167 |
| 57.25 | 78 | 166 |
| 57.3 | 79 | 165 |
| 57.35 | 77 | 163 |
| 57.4 | 75 | 162 |
| 57.45 | 74 | 160 |
| 57.5 | 74 | 159 |
| 57.55 | 73 | 160 |
| 57.6 | 73 | 157 |
| 57.65 | 72 | 157 |
| 57.7 | 70 | 156 |
| 57.75 | 68 | 155 |
| 57.8 | 68 | 154 |
| 57.85 | 67 | 153 |
| 57.9 | 67 | 153 |
| 57.95 | 65 | 152 |
| 58.0 | 65 | 151 |
| 58.05 | 63 | 150 |
| 58.1 | 64 | 148 |
| 58.15 | 64 | 149 |
| 58.2 | 63 | 148 |
| 58.25 | 62 | 145 |
| 58.3 | 60 | 144 |
| 58.35 | 60 | 142 |
| 58.4 | 59 | 143 |
| 58.45 | 57 | 142 |
| 58.5 | 57 | 139 |
| 58.55 | 55 | 140 |
| 58.6 | 54 | 138 |
| 58.65 | 53 | 138 |
| 58.7 | 52 | 137 |
| 58.75 | 51 | 136 |
| 58.8 | 50 | 134 |
| 58.85 | 50 | 134 |
| 58.9 | 49 | 132 |
| 58.95 | 48 | 132 |
| 59.0 | 47 | 130 |
| nan | 48 | 129 |
| nan | 47 | 128 |
| nan | 45 | 128 |
| nan | 44 | 125 |
| nan | 43 | 125 |
| nan | 42 | 125 |
| nan | 41 | 122 |
| nan | 40 | 121 |
| nan | 39 | 121 |
| nan | 40 | 120 |
| nan | 39 | 118 |
| nan | 37 | 116 |
| nan | 34 | 116 |
| nan | 33 | 115 |
| nan | 32 | 114 |
| nan | 32 | 113 |
| nan | 32 | 112 |
| nan | 30 | 111 |
| nan | 28 | 109 |
| 60.0 | 28 | 109 |
| nan | 27 | 108 |
| nan | 27 | 107 |
| nan | 26 | 105 |
| nan | 25 | 104 |
| nan | 24 | 102 |
| nan | 22 | 101 |
| nan | 21 | 99 |
| nan | 20 | 99 |
| nan | 19 | 100 |
| nan | 18 | 98 |
| nan | 17 | 97 |
| nan | 16 | 95 |
| nan | 14 | 95 |
| nan | 15 | 93 |
| nan | 13 | 93 |
| nan | 12 | 91 |
| nan | 10 | 90 |
| nan | 9 | 90 |
| 61.0 | 9 | 90 |
| nan | 9 | 88 |
| nan | 9 | 87 |
| nan | 7 | 86 |
| nan | 7 | 85 |
| nan | 5 | 84 |
| nan | 4 | 83 |
| nan | 2 | 82 |
| nan | 1 | 80 |
| nan | 2 | 80 |
| nan | 108 | 79 |
| nan | -2 | 79 |
| nan | -2 | 78 |
| nan | -1 | 76 |
| nan | -3 | 75 |
| nan | -3 | 73 |
| nan | -2 | 73 |
| nan | -4 | 71 |
| nan | -3 | 70 |
| 62.0 | -3 | 69 |
| nan | -2 | 68 |
| nan | -3 | 68 |
| nan | -3 | 66 |
| nan | -3 | 65 |
| nan | -3 | 63 |
| nan | -3 | 62 |
| nan | -3 | 61 |
| nan | -3 | 61 |
| nan | -3 | 61 |